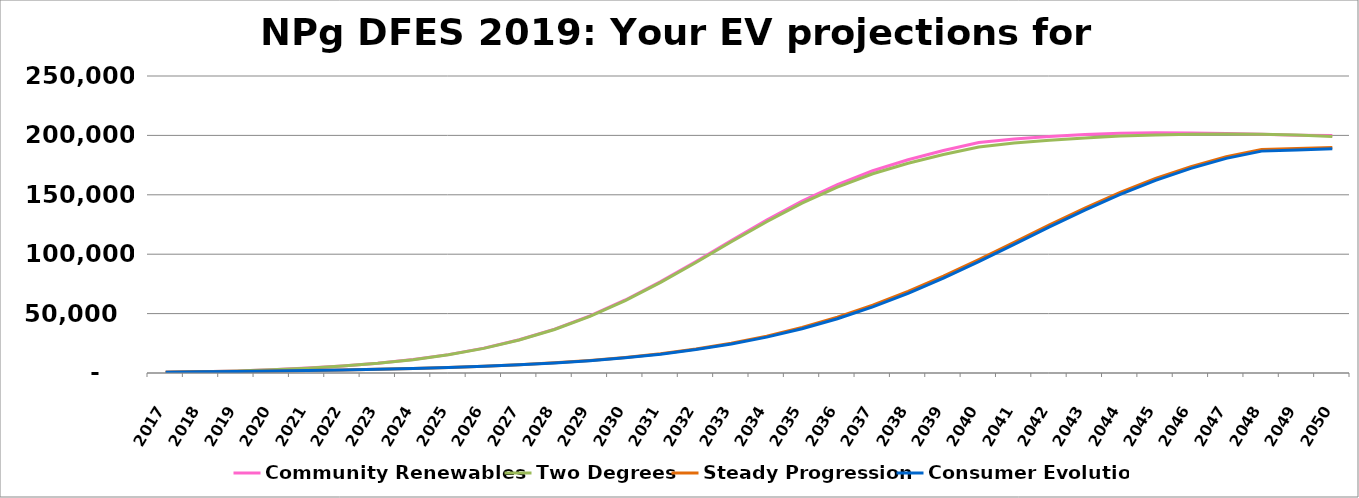
| Category | Community Renewables | Two Degrees | Steady Progression | Consumer Evolution |
|---|---|---|---|---|
| 2017.0 | 643 | 643 | 643 | 643 |
| 2018.0 | 982 | 982 | 982 | 982 |
| 2019.0 | 1762 | 1748 | 1345 | 1345 |
| 2020.0 | 2774 | 2747 | 1710 | 1705 |
| 2021.0 | 4113 | 4073 | 2134 | 2126 |
| 2022.0 | 5875 | 5817 | 2592 | 2579 |
| 2023.0 | 8219 | 8139 | 3126 | 3107 |
| 2024.0 | 11342 | 11235 | 3793 | 3766 |
| 2025.0 | 15479 | 15337 | 4638 | 4593 |
| 2026.0 | 20916 | 20731 | 5669 | 5608 |
| 2027.0 | 27965 | 27726 | 6950 | 6855 |
| 2028.0 | 36947 | 36632 | 8574 | 8439 |
| 2029.0 | 48097 | 47693 | 10579 | 10390 |
| 2030.0 | 61483 | 60960 | 13095 | 12828 |
| 2031.0 | 76948 | 76269 | 16244 | 15875 |
| 2032.0 | 93899 | 93026 | 20193 | 19693 |
| 2033.0 | 111537 | 110422 | 25080 | 24419 |
| 2034.0 | 128726 | 127315 | 31057 | 30208 |
| 2035.0 | 144696 | 142923 | 38303 | 37247 |
| 2036.0 | 158645 | 156458 | 46944 | 45689 |
| 2037.0 | 170241 | 167708 | 57068 | 55625 |
| 2038.0 | 179542 | 176574 | 68651 | 67065 |
| 2039.0 | 187222 | 183851 | 81553 | 79859 |
| 2040.0 | 193947 | 190265 | 95506 | 93750 |
| 2041.0 | 197030 | 193604 | 110076 | 108288 |
| 2042.0 | 199144 | 195833 | 124728 | 122942 |
| 2043.0 | 200791 | 197828 | 138881 | 137122 |
| 2044.0 | 201863 | 199425 | 152029 | 150321 |
| 2045.0 | 202203 | 200398 | 163767 | 162139 |
| 2046.0 | 202117 | 200984 | 173719 | 172203 |
| 2047.0 | 201656 | 201178 | 182077 | 180660 |
| 2048.0 | 200865 | 200972 | 188078 | 186765 |
| 2049.0 | 200222 | 200402 | 188977 | 187782 |
| 2050.0 | 199837 | 199094 | 189810 | 188738 |